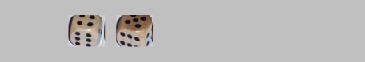
| Category | 1 | 2 | 3 | 4 | 5 | 6 |
|---|---|---|---|---|---|---|
|  | 0 | 0 | 0 | 0 | 0 | 0 |
| 4 | 0 | 0 | 0 | 1 | 0 | 0 |
| 5 | 0 | 0 | 0 | 0 | 1 | 0 |